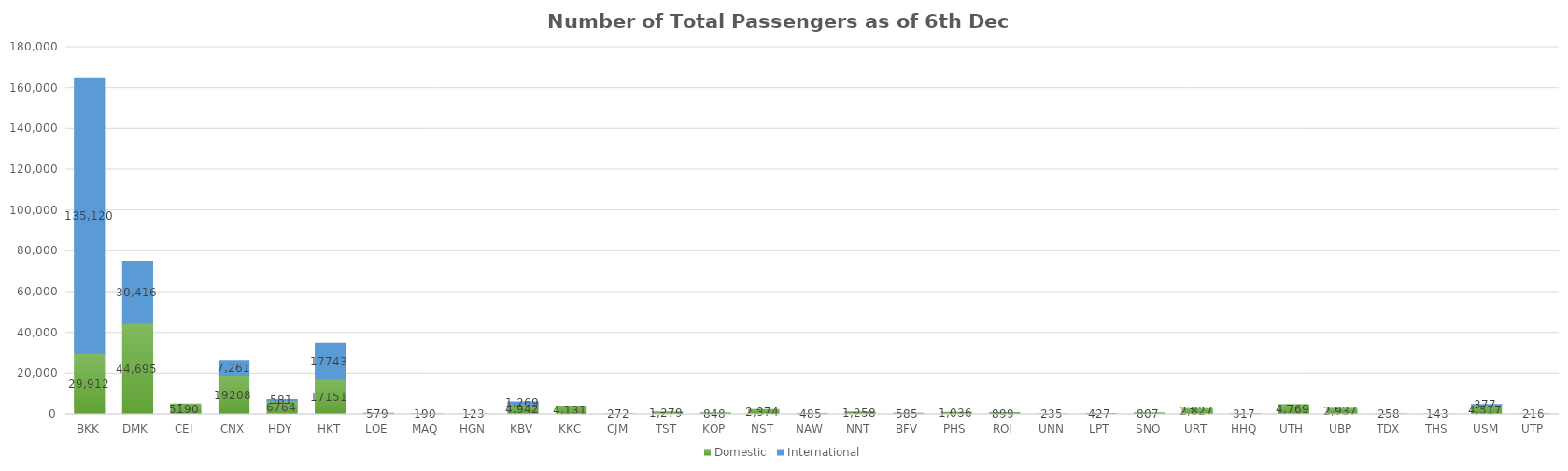
| Category | Domestic | International |
|---|---|---|
| BKK | 29912 | 135120 |
| DMK | 44695 | 30416 |
| CEI | 5190 | 0 |
| CNX | 19208 | 7261 |
| HDY | 6764 | 581 |
| HKT | 17151 | 17743 |
| LOE | 579 | 0 |
| MAQ | 190 | 0 |
| HGN | 123 | 0 |
| KBV | 4942 | 1269 |
| KKC | 4131 | 0 |
| CJM | 272 | 0 |
| TST | 1279 | 0 |
| KOP | 848 | 0 |
| NST | 2374 | 0 |
| NAW | 485 | 0 |
| NNT | 1258 | 0 |
| BFV | 585 | 0 |
| PHS | 1036 | 0 |
| ROI | 899 | 0 |
| UNN | 235 | 0 |
| LPT | 427 | 0 |
| SNO | 807 | 0 |
| URT | 2827 | 0 |
| HHQ | 317 | 0 |
| UTH | 4769 | 0 |
| UBP | 2937 | 0 |
| TDX | 258 | 0 |
| THS | 143 | 0 |
| USM | 4517 | 377 |
| UTP | 216 | 0 |